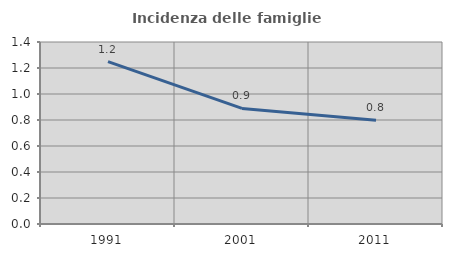
| Category | Incidenza delle famiglie numerose |
|---|---|
| 1991.0 | 1.249 |
| 2001.0 | 0.889 |
| 2011.0 | 0.798 |